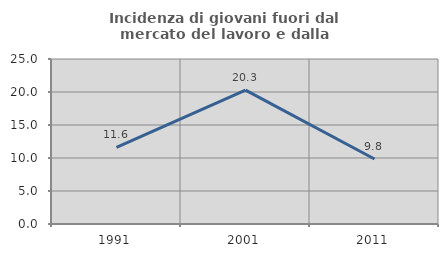
| Category | Incidenza di giovani fuori dal mercato del lavoro e dalla formazione  |
|---|---|
| 1991.0 | 11.609 |
| 2001.0 | 20.278 |
| 2011.0 | 9.848 |